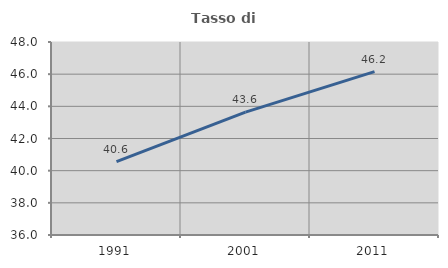
| Category | Tasso di occupazione   |
|---|---|
| 1991.0 | 40.56 |
| 2001.0 | 43.64 |
| 2011.0 | 46.158 |